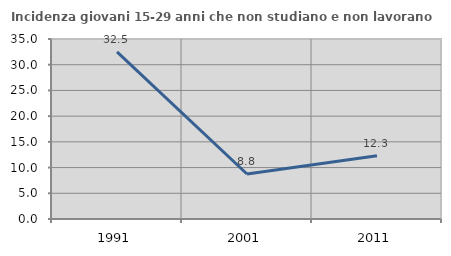
| Category | Incidenza giovani 15-29 anni che non studiano e non lavorano  |
|---|---|
| 1991.0 | 32.499 |
| 2001.0 | 8.751 |
| 2011.0 | 12.317 |